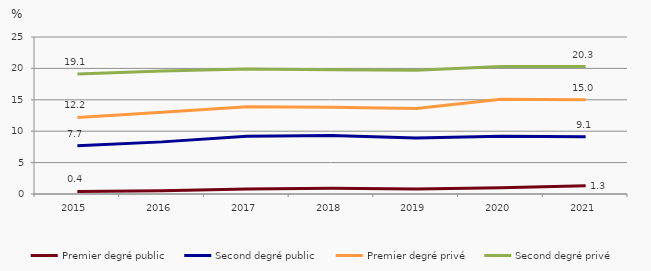
| Category | Premier degré public | Second degré public | Premier degré privé | Second degré privé |
|---|---|---|---|---|
| 2015.0 | 0.4 | 7.7 | 12.2 | 19.1 |
| 2016.0 | 0.5 | 8.3 | 13 | 19.6 |
| 2017.0 | 0.8 | 9.2 | 13.9 | 19.9 |
| 2018.0 | 0.9 | 9.3 | 13.8 | 19.8 |
| 2019.0 | 0.8 | 8.9 | 13.6 | 19.7 |
| 2020.0 | 1 | 9.2 | 15.1 | 20.3 |
| 2021.0 | 1.3 | 9.1 | 15 | 20.3 |